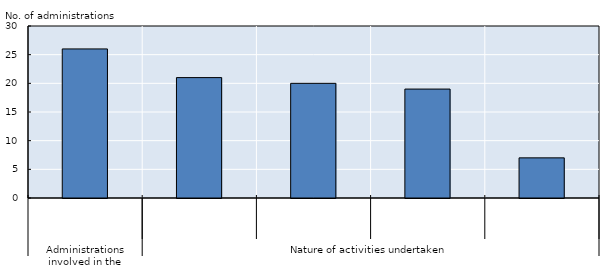
| Category | Series 0 |
|---|---|
| 0 | 26 |
| 1 | 21 |
| 2 | 20 |
| 3 | 19 |
| 4 | 7 |